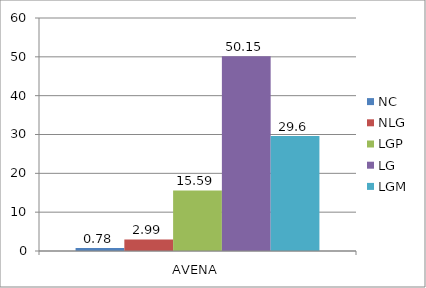
| Category | NC | NLG | LGP | LG | LGM |
|---|---|---|---|---|---|
| 0 | 0.78 | 2.99 | 15.59 | 50.15 | 29.6 |